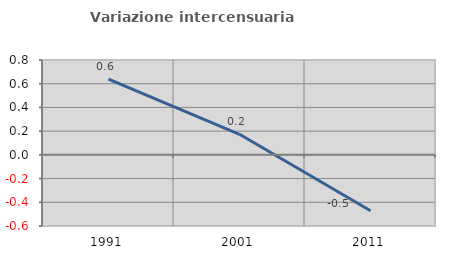
| Category | Variazione intercensuaria annua |
|---|---|
| 1991.0 | 0.639 |
| 2001.0 | 0.173 |
| 2011.0 | -0.472 |